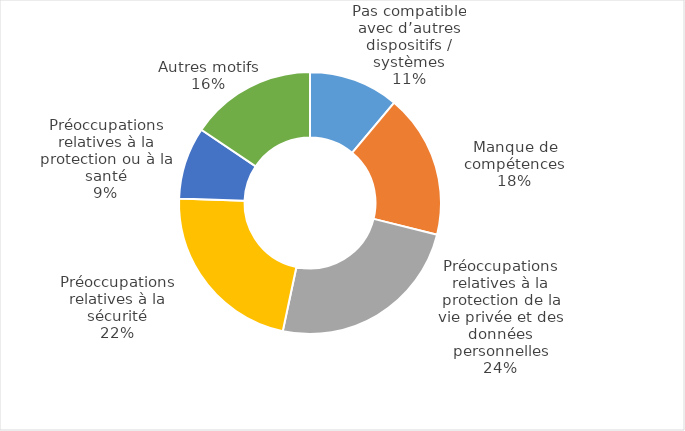
| Category | Series 0 |
|---|---|
| Pas compatible avec d’autres dispositifs / systèmes | 5 |
| Manque de compétences | 8 |
| Préoccupations relatives à la protection de la vie privée et des données personnelles | 11 |
| Préoccupations relatives à la sécurité | 10 |
| Préoccupations relatives à la protection ou à la santé | 4 |
| Autres motifs | 7 |